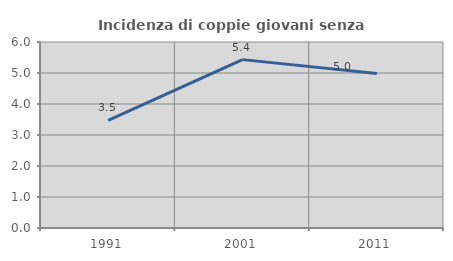
| Category | Incidenza di coppie giovani senza figli |
|---|---|
| 1991.0 | 3.475 |
| 2001.0 | 5.431 |
| 2011.0 | 4.988 |